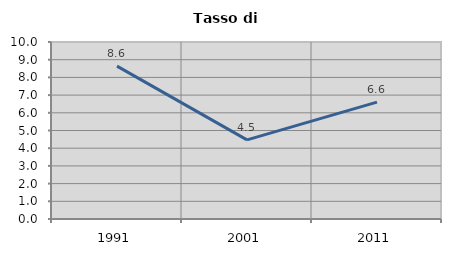
| Category | Tasso di disoccupazione   |
|---|---|
| 1991.0 | 8.639 |
| 2001.0 | 4.468 |
| 2011.0 | 6.606 |